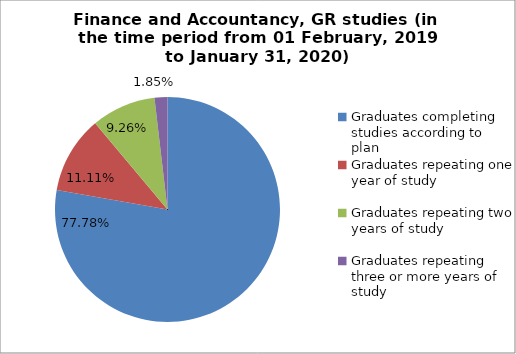
| Category | Series 0 |
|---|---|
| Graduates completing studies according to plan | 77.778 |
| Graduates repeating one year of study | 11.111 |
| Graduates repeating two years of study | 9.259 |
| Graduates repeating three or more years of study | 1.852 |